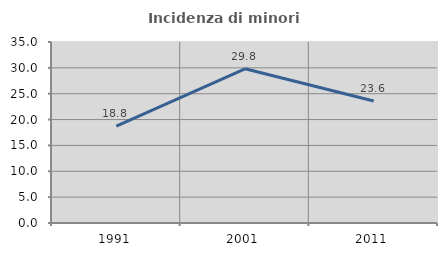
| Category | Incidenza di minori stranieri |
|---|---|
| 1991.0 | 18.75 |
| 2001.0 | 29.825 |
| 2011.0 | 23.585 |